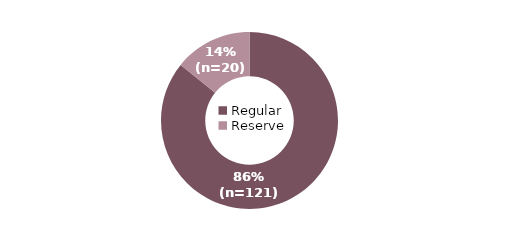
| Category | Series 0 |
|---|---|
| Regular | 121 |
| Reserve | 20 |